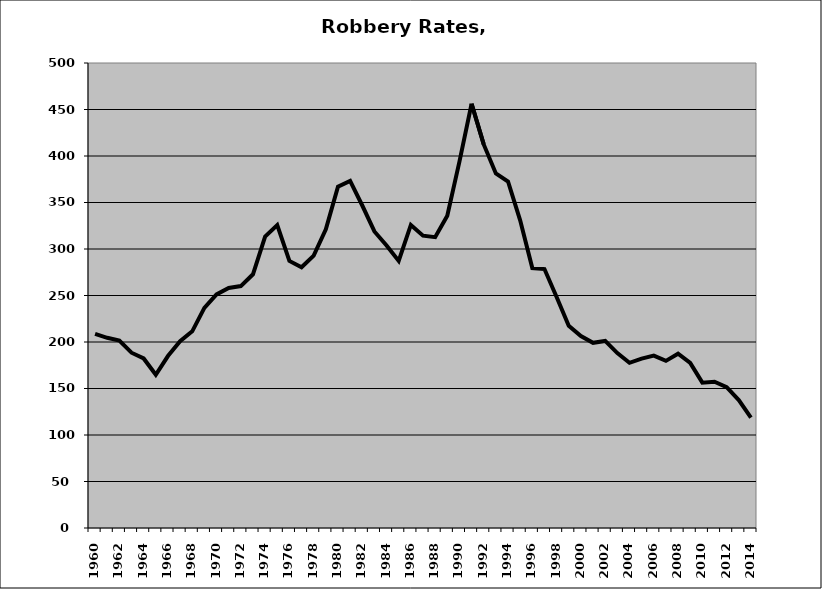
| Category | Robbery |
|---|---|
| 1960.0 | 208.786 |
| 1961.0 | 204.494 |
| 1962.0 | 201.478 |
| 1963.0 | 188.499 |
| 1964.0 | 182.315 |
| 1965.0 | 164.741 |
| 1966.0 | 184.891 |
| 1967.0 | 200.854 |
| 1968.0 | 211.491 |
| 1969.0 | 236.743 |
| 1970.0 | 251.107 |
| 1971.0 | 258.128 |
| 1972.0 | 260.128 |
| 1973.0 | 272.793 |
| 1974.0 | 313.377 |
| 1975.0 | 325.778 |
| 1976.0 | 287.14 |
| 1977.0 | 280.338 |
| 1978.0 | 292.911 |
| 1979.0 | 321.069 |
| 1980.0 | 367.017 |
| 1981.0 | 373.217 |
| 1982.0 | 346.785 |
| 1983.0 | 318.866 |
| 1984.0 | 303.753 |
| 1985.0 | 287.126 |
| 1986.0 | 325.874 |
| 1987.0 | 314.333 |
| 1988.0 | 312.691 |
| 1989.0 | 335.718 |
| 1990.0 | 394.012 |
| 1991.0 | 456.147 |
| 1992.0 | 412.458 |
| 1993.0 | 381.158 |
| 1994.0 | 372.6 |
| 1995.0 | 330.845 |
| 1996.0 | 279.446 |
| 1997.0 | 278.438 |
| 1998.0 | 248.46 |
| 1999.0 | 217.383 |
| 2000.0 | 206.461 |
| 2001.0 | 199.126 |
| 2002.0 | 201.121 |
| 2003.0 | 188.045 |
| 2004.0 | 177.643 |
| 2005.0 | 182.172 |
| 2006.0 | 185.334 |
| 2007.0 | 179.731 |
| 2008.0 | 187.395 |
| 2009.0 | 177.554 |
| 2010.0 | 156.298 |
| 2011.0 | 157.211 |
| 2012.0 | 151.381 |
| 2013.0 | 137.566 |
| 2014.0 | 118.776 |